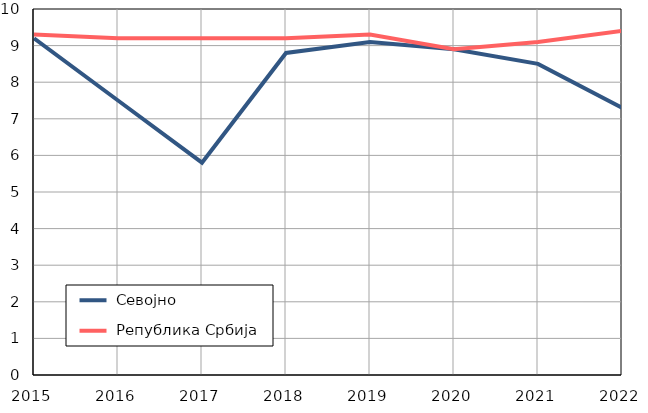
| Category |  Севојно |  Република Србија |
|---|---|---|
| 2015.0 | 9.2 | 9.3 |
| 2016.0 | 7.5 | 9.2 |
| 2017.0 | 5.8 | 9.2 |
| 2018.0 | 8.8 | 9.2 |
| 2019.0 | 9.1 | 9.3 |
| 2020.0 | 8.9 | 8.9 |
| 2021.0 | 8.5 | 9.1 |
| 2022.0 | 7.3 | 9.4 |